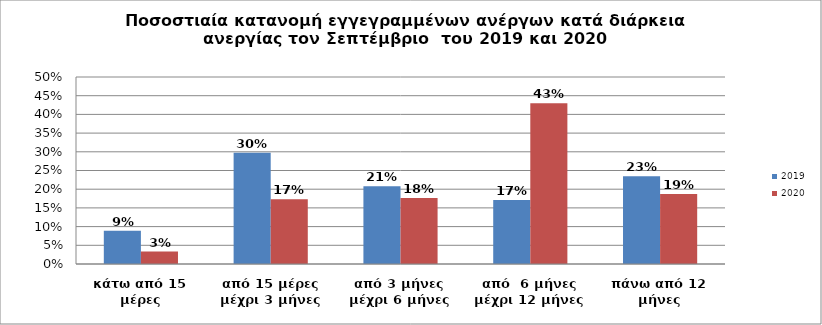
| Category | 2019 | 2020 |
|---|---|---|
| κάτω από 15 μέρες | 0.089 | 0.033 |
| από 15 μέρες μέχρι 3 μήνες | 0.298 | 0.173 |
| από 3 μήνες μέχρι 6 μήνες | 0.208 | 0.176 |
| από  6 μήνες μέχρι 12 μήνες | 0.171 | 0.43 |
| πάνω από 12 μήνες | 0.235 | 0.187 |